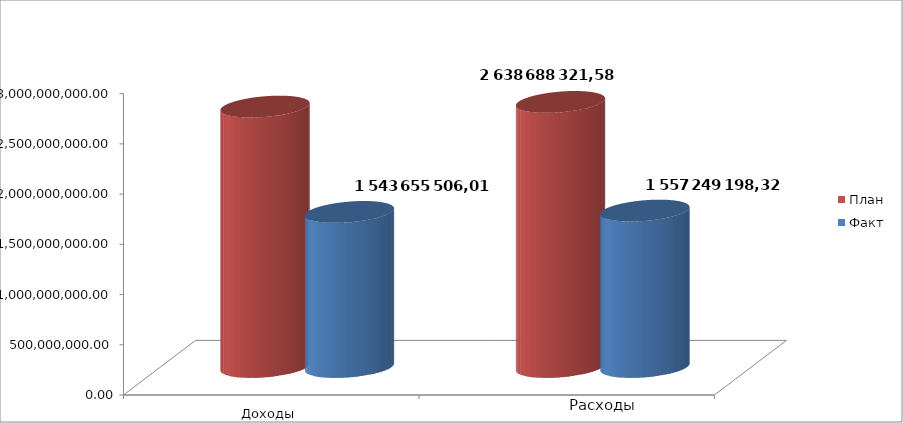
| Category | План | Факт |
|---|---|---|
| 0 | 2592196903.63 | 1543655506.01 |
| 1 | 2638688321.58 | 1557249198.32 |